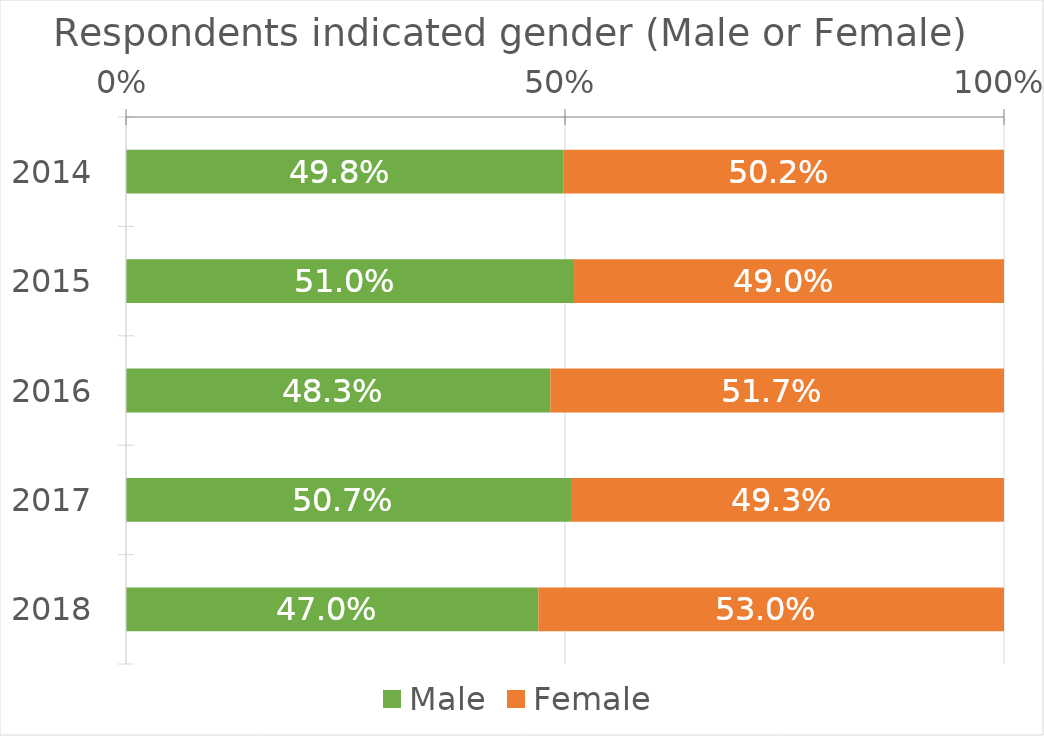
| Category | Male | Female |
|---|---|---|
| 2014.0 | 0.498 | 0.502 |
| 2015.0 | 0.51 | 0.49 |
| 2016.0 | 0.483 | 0.517 |
| 2017.0 | 0.507 | 0.493 |
| 2018.0 | 0.47 | 0.53 |